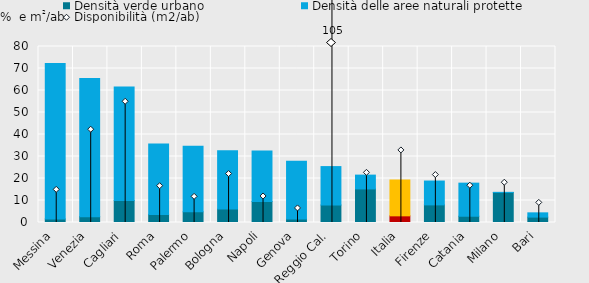
| Category | Densità verde urbano | Densità delle aree naturali protette |
|---|---|---|
| Messina | 1.621 | 70.61 |
| Venezia | 2.646 | 62.803 |
| Cagliari | 9.953 | 51.6 |
| Roma | 3.673 | 31.971 |
| Palermo | 4.838 | 29.845 |
| Bologna | 6.097 | 26.541 |
| Napoli | 9.566 | 22.906 |
| Genova | 1.549 | 26.261 |
| Reggio Cal. | 7.952 | 17.464 |
| Torino | 15.261 | 6.278 |
| Italia | 3.027 | 16.293 |
| Firenze | 8.007 | 10.841 |
| Catania | 2.849 | 15.038 |
| Milano | 13.661 | 0.019 |
| Bari | 2.449 | 1.94 |